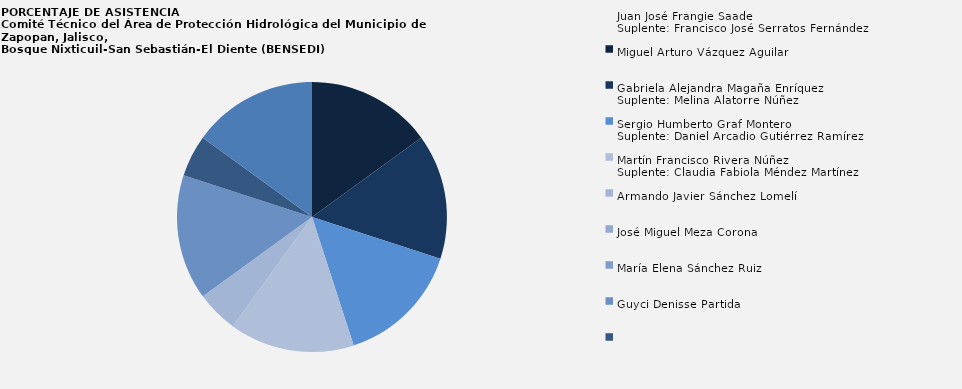
| Category | Juan José Frangie Saade
Suplente: Francisco José Serratos Fernández |
|---|---|
| Juan José Frangie Saade
Suplente: Francisco José Serratos Fernández | 3 |
| Miguel Arturo Vázquez Aguilar  | 3 |
| Gabriela Alejandra Magaña Enríquez
Suplente: Melina Alatorre Núñez | 3 |
| Sergio Humberto Graf Montero
Suplente: Daniel Arcadio Gutiérrez Ramírez | 3 |
| Martín Francisco Rivera Núñez
Suplente: Claudia Fabiola Méndez Martínez | 1 |
| Armando Javier Sánchez Lomelí  | 0 |
| José Miguel Meza Corona  | 0 |
| María Elena Sánchez Ruiz  | 3 |
| Guyci Denisse Partida  | 1 |
| Ignacio Aguilar Jiménez
Suplente: Mario Alberto Espinosa Ceballos | 3 |